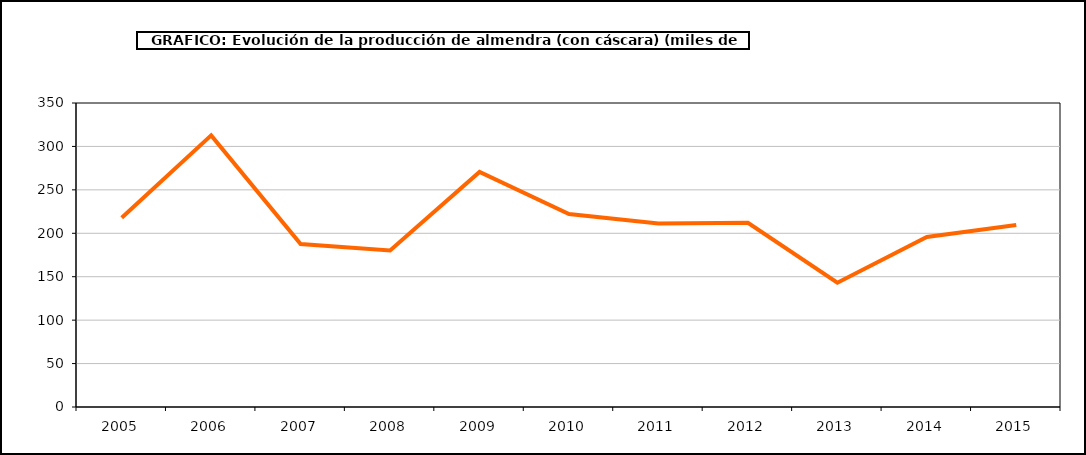
| Category | producción almendro |
|---|---|
| 2005.0 | 217.869 |
| 2006.0 | 312.702 |
| 2007.0 | 187.656 |
| 2008.0 | 180.103 |
| 2009.0 | 270.686 |
| 2010.0 | 222.217 |
| 2011.0 | 211.179 |
| 2012.0 | 212.063 |
| 2013.0 | 143.081 |
| 2014.0 | 195.699 |
| 2015.0 | 209.443 |